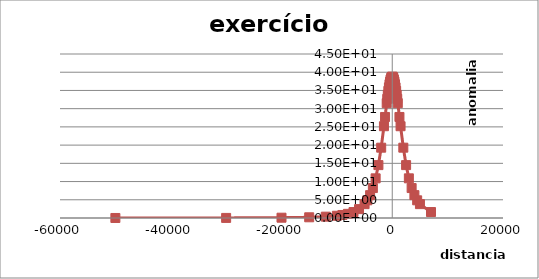
| Category | Series 1 |
|---|---|
| -50000.0 | 0.005 |
| -30000.0 | 0.025 |
| -20000.0 | 0.083 |
| -15000.0 | 0.193 |
| -12000.0 | 0.368 |
| -10000.0 | 0.617 |
| -9000.0 | 0.828 |
| -8000.0 | 1.144 |
| -7000.0 | 1.636 |
| -6000.0 | 2.436 |
| -5000.0 | 3.805 |
| -4500.0 | 4.851 |
| -4000.0 | 6.272 |
| -3500.0 | 8.216 |
| -3000.0 | 10.885 |
| -2500.0 | 14.513 |
| -2000.0 | 19.295 |
| -1500.0 | 25.181 |
| -1300.0 | 27.725 |
| -1000.0 | 31.504 |
| -900.0 | 32.698 |
| -800.0 | 33.831 |
| -700.0 | 34.886 |
| -600.0 | 35.846 |
| -500.0 | 36.693 |
| -400.0 | 37.411 |
| -300.0 | 37.986 |
| -200.0 | 38.406 |
| -100.0 | 38.661 |
| -50.0 | 38.726 |
| 0.0 | 38.747 |
| 50.0 | 38.726 |
| 100.0 | 38.661 |
| 200.0 | 38.406 |
| 300.0 | 37.986 |
| 400.0 | 37.411 |
| 500.0 | 36.693 |
| 600.0 | 35.846 |
| 700.0 | 34.886 |
| 800.0 | 33.831 |
| 900.0 | 32.698 |
| 1000.0 | 31.504 |
| 1300.0 | 27.725 |
| 1500.0 | 25.181 |
| 2000.0 | 19.295 |
| 2500.0 | 14.513 |
| 3000.0 | 10.885 |
| 3500.0 | 8.216 |
| 4000.0 | 6.272 |
| 4500.0 | 4.851 |
| 5000.0 | 3.805 |
| 7000.0 | 1.636 |